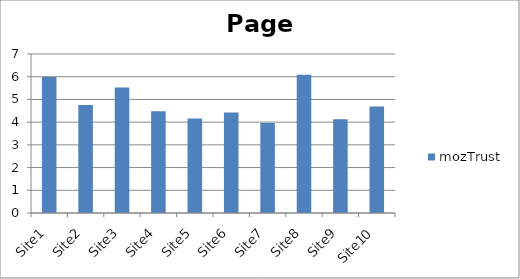
| Category | mozTrust |
|---|---|
| Site1 | 5.99 |
| Site2 | 4.75 |
| Site3 | 5.53 |
| Site4 | 4.48 |
| Site5 | 4.16 |
| Site6 | 4.42 |
| Site7 | 3.96 |
| Site8 | 6.09 |
| Site9 | 4.13 |
| Site10 | 4.69 |